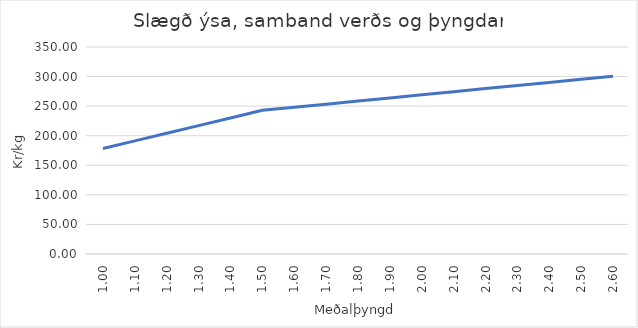
| Category | 164.43 |
|---|---|
| 1.0 | 178.357 |
| 1.1 | 191.265 |
| 1.2 | 204.173 |
| 1.3 | 217.081 |
| 1.4 | 229.99 |
| 1.5 | 242.898 |
| 1.6 | 248.147 |
| 1.7 | 253.396 |
| 1.8 | 258.646 |
| 1.9 | 263.895 |
| 2.0 | 269.144 |
| 2.1 | 274.394 |
| 2.2 | 279.643 |
| 2.3 | 284.892 |
| 2.4 | 290.141 |
| 2.5 | 295.391 |
| 2.6 | 300.64 |